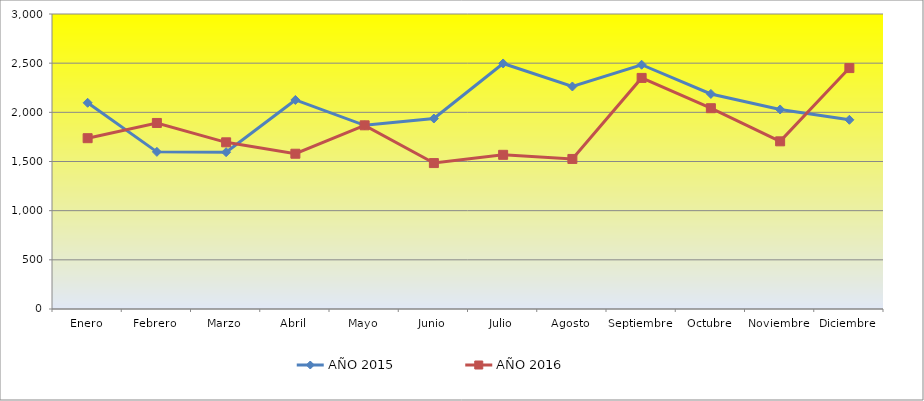
| Category | AÑO 2015 | AÑO 2016 |
|---|---|---|
| Enero | 2097 | 1737 |
| Febrero | 1598 | 1892 |
| Marzo | 1595 | 1695 |
| Abril | 2126 | 1579 |
| Mayo | 1868 | 1868 |
| Junio | 1937 | 1484 |
| Julio | 2497 | 1568 |
| Agosto | 2263 | 1526 |
| Septiembre | 2484 | 2350 |
| Octubre | 2187 | 2042 |
| Noviembre | 2029 | 1705 |
| Diciembre | 1924 | 2450 |